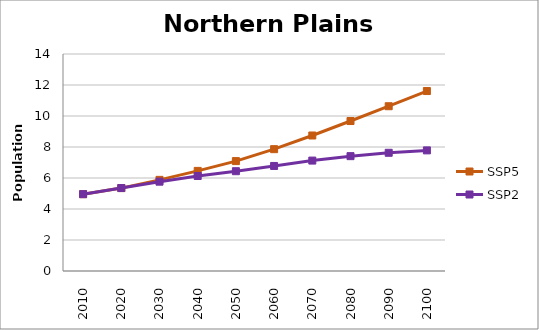
| Category | SSP5 | SSP2 |
|---|---|---|
| 2010.0 | 4956777 | 4956777 |
| 2020.0 | 5348266 | 5353496 |
| 2030.0 | 5879482 | 5762437 |
| 2040.0 | 6458399 | 6128040 |
| 2050.0 | 7090174 | 6439439 |
| 2060.0 | 7860014 | 6777039 |
| 2070.0 | 8742879 | 7123907 |
| 2080.0 | 9675685 | 7410113 |
| 2090.0 | 10630562 | 7626041 |
| 2100.0 | 11610433 | 7781800 |